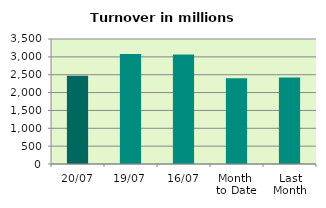
| Category | Series 0 |
|---|---|
| 20/07 | 2468.382 |
| 19/07 | 3077.378 |
| 16/07 | 3064.547 |
| Month 
to Date | 2404.202 |
| Last
Month | 2424.747 |